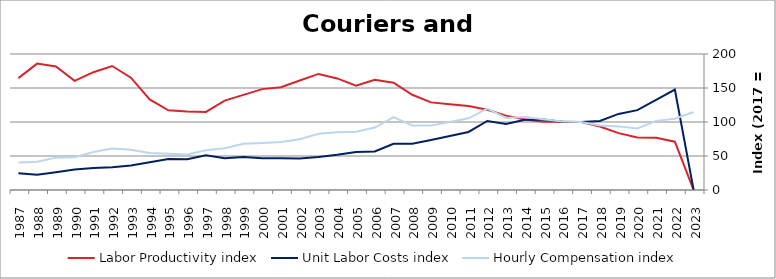
| Category | Labor Productivity index | Unit Labor Costs index | Hourly Compensation index |
|---|---|---|---|
| 2023.0 | 0 | 0 | 114.736 |
| 2022.0 | 70.989 | 147.622 | 104.796 |
| 2021.0 | 76.718 | 132.526 | 101.672 |
| 2020.0 | 77.069 | 117.434 | 90.506 |
| 2019.0 | 83.61 | 111.905 | 93.563 |
| 2018.0 | 93.471 | 101.619 | 94.983 |
| 2017.0 | 100 | 100 | 100 |
| 2016.0 | 100.456 | 100.344 | 100.801 |
| 2015.0 | 100.287 | 103.714 | 104.011 |
| 2014.0 | 103.815 | 103.291 | 107.231 |
| 2013.0 | 109.354 | 96.929 | 105.996 |
| 2012.0 | 117.931 | 101.458 | 119.65 |
| 2011.0 | 123.548 | 85.371 | 105.474 |
| 2010.0 | 126.144 | 79.332 | 100.072 |
| 2009.0 | 128.856 | 73.477 | 94.679 |
| 2008.0 | 140.009 | 67.861 | 95.011 |
| 2007.0 | 157.832 | 67.927 | 107.211 |
| 2006.0 | 162.185 | 56.628 | 91.843 |
| 2005.0 | 153.368 | 55.944 | 85.8 |
| 2004.0 | 164.104 | 51.835 | 85.063 |
| 2003.0 | 170.702 | 48.481 | 82.757 |
| 2002.0 | 161.011 | 46.344 | 74.619 |
| 2001.0 | 151.175 | 46.616 | 70.472 |
| 2000.0 | 148.367 | 46.639 | 69.197 |
| 1999.0 | 139.847 | 48.637 | 68.017 |
| 1998.0 | 131.39 | 46.692 | 61.349 |
| 1997.0 | 114.8 | 50.931 | 58.468 |
| 1996.0 | 115.313 | 45.243 | 52.172 |
| 1995.0 | 117.16 | 45.473 | 53.277 |
| 1994.0 | 133.201 | 40.788 | 54.33 |
| 1993.0 | 165.152 | 35.886 | 59.267 |
| 1992.0 | 182.324 | 33.529 | 61.131 |
| 1991.0 | 173.211 | 32.181 | 55.741 |
| 1990.0 | 160.474 | 30.051 | 48.224 |
| 1989.0 | 181.605 | 26.211 | 47.6 |
| 1988.0 | 185.887 | 22.382 | 41.605 |
| 1987.0 | 164.557 | 24.497 | 40.311 |